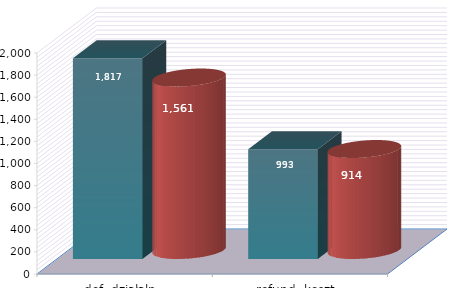
| Category | 7 podstawowych form - rozpoczęcie | 7 podstawowych form - graduacja |
|---|---|---|
| dof. działaln. | 1817 | 1561 |
| refund. koszt. | 993 | 914 |